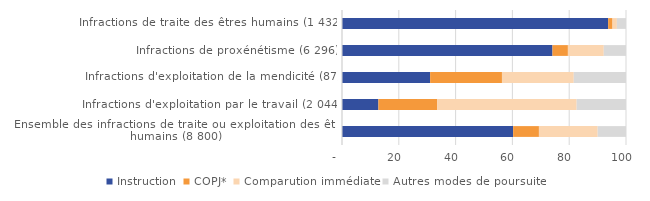
| Category | Instruction | COPJ* | Comparution immédiate | Autres modes de poursuite |
|---|---|---|---|---|
| Infractions de traite des êtres humains (1 432) | 93.715 | 1.536 | 1.536 | 3.212 |
| Infractions de proxénétisme (6 296) | 74.111 | 5.432 | 12.627 | 7.83 |
| Infractions d'exploitation de la mendicité (87) | 31.034 | 25.287 | 25.287 | 18.391 |
| Infractions d'exploitation par le travail (2 044) | 12.818 | 20.744 | 49.07 | 17.368 |
| Ensemble des infractions de traite ou exploitation des êtres humains (8 800) | 60.261 | 9.08 | 20.693 | 9.966 |